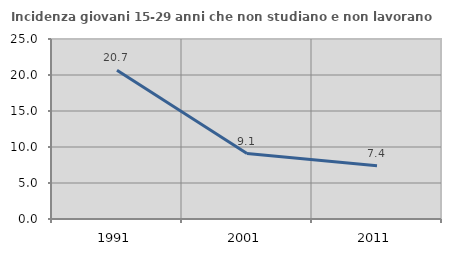
| Category | Incidenza giovani 15-29 anni che non studiano e non lavorano  |
|---|---|
| 1991.0 | 20.675 |
| 2001.0 | 9.091 |
| 2011.0 | 7.407 |